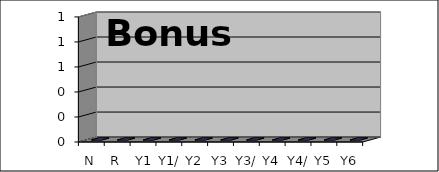
| Category | Series 0 |
|---|---|
| N | 0 |
| R | 0 |
|  Y1 | 0 |
| Y1/2 | 0 |
| Y2 | 0 |
| Y3 | 0 |
| Y3/4 | 0 |
| Y4 | 0 |
| Y4/5 | 0 |
| Y5 | 0 |
| Y6 | 0 |